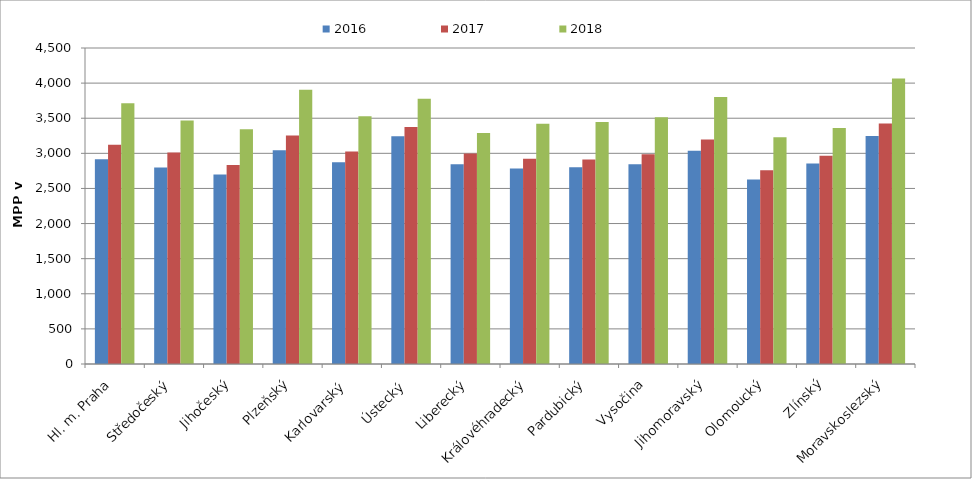
| Category | 2016 | 2017 | 2018 |
|---|---|---|---|
| Hl. m. Praha | 2917.082 | 3121.236 | 3714.335 |
| Středočeský | 2797.358 | 3011.084 | 3466.117 |
| Jihočeský | 2700.229 | 2834.883 | 3342.361 |
| Plzeňský | 3042.218 | 3255.235 | 3906.282 |
| Karlovarský  | 2873.811 | 3026.21 | 3526.95 |
| Ústecký   | 3244.256 | 3374.017 | 3778.797 |
| Liberecký | 2843.299 | 2999.253 | 3288.313 |
| Královéhradecký | 2784.53 | 2923.757 | 3420.794 |
| Pardubický | 2800.921 | 2913.044 | 3447.392 |
| Vysočina | 2843.813 | 2988.301 | 3514.278 |
| Jihomoravský | 3036.297 | 3198.128 | 3803.224 |
| Olomoucký | 2628.999 | 2760.468 | 3229.779 |
| Zlínský | 2855.837 | 2966.897 | 3359.036 |
| Moravskoslezský | 3246 | 3424.745 | 4065.842 |